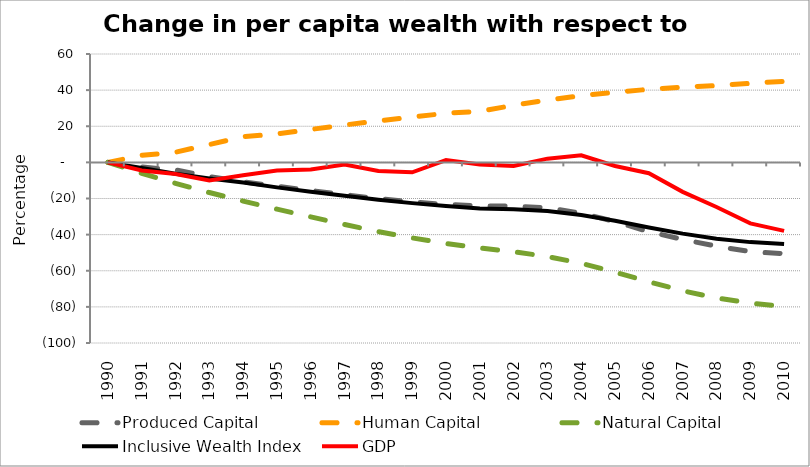
| Category | Produced Capital  | Human Capital | Natural Capital | Inclusive Wealth Index | GDP |
|---|---|---|---|---|---|
| 1990.0 | 0 | 0 | 0 | 0 | 0 |
| 1991.0 | -2.573 | 3.881 | -6.046 | -3.106 | -4.483 |
| 1992.0 | -4.166 | 5.649 | -11.587 | -6.258 | -6.399 |
| 1993.0 | -7.905 | 9.89 | -16.685 | -8.896 | -10.025 |
| 1994.0 | -10.757 | 14.171 | -21.43 | -11.17 | -7.155 |
| 1995.0 | -13.206 | 15.733 | -25.872 | -13.85 | -4.468 |
| 1996.0 | -15.583 | 18.24 | -30.188 | -16.217 | -3.998 |
| 1997.0 | -17.867 | 20.708 | -34.403 | -18.517 | -1.189 |
| 1998.0 | -20.09 | 22.984 | -38.344 | -20.69 | -4.823 |
| 1999.0 | -21.944 | 25.087 | -41.811 | -22.561 | -5.503 |
| 2000.0 | -23.279 | 27.179 | -44.907 | -24.128 | 1.271 |
| 2001.0 | -24.028 | 28.222 | -47.383 | -25.482 | -1.115 |
| 2002.0 | -24.274 | 31.594 | -49.498 | -25.98 | -1.984 |
| 2003.0 | -25.128 | 34.518 | -52.112 | -26.982 | 2.055 |
| 2004.0 | -28.117 | 36.949 | -55.903 | -29.151 | 3.96 |
| 2005.0 | -32.735 | 38.847 | -60.754 | -32.344 | -2.011 |
| 2006.0 | -38.393 | 40.441 | -66.105 | -36.076 | -6.009 |
| 2007.0 | -42.659 | 41.696 | -71.07 | -39.435 | -16.32 |
| 2008.0 | -46.398 | 42.494 | -75.08 | -42.247 | -24.719 |
| 2009.0 | -49.424 | 43.724 | -77.937 | -44.149 | -33.747 |
| 2010.0 | -50.56 | 44.873 | -79.83 | -45.191 | -37.923 |